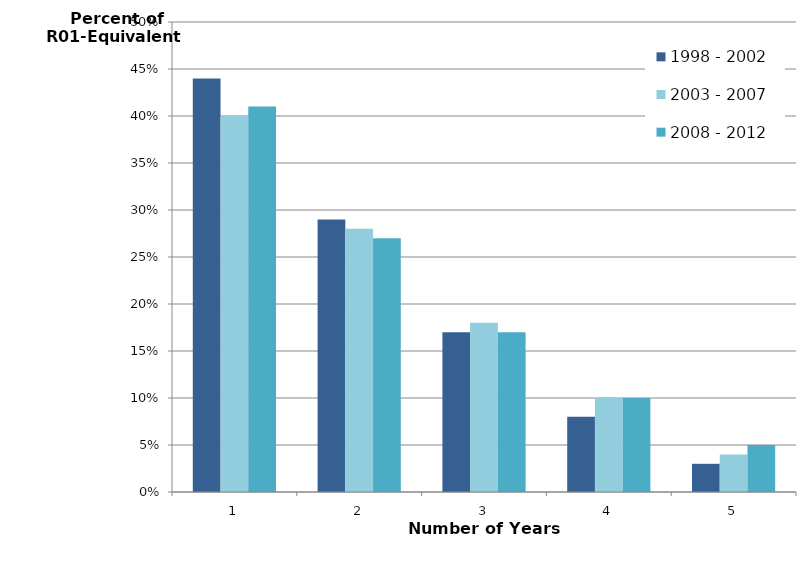
| Category | 1998 - 2002 | 2003 - 2007 | 2008 - 2012 |
|---|---|---|---|
| 0 | 0.44 | 0.4 | 0.41 |
| 1 | 0.29 | 0.28 | 0.27 |
| 2 | 0.17 | 0.18 | 0.17 |
| 3 | 0.08 | 0.1 | 0.1 |
| 4 | 0.03 | 0.04 | 0.05 |